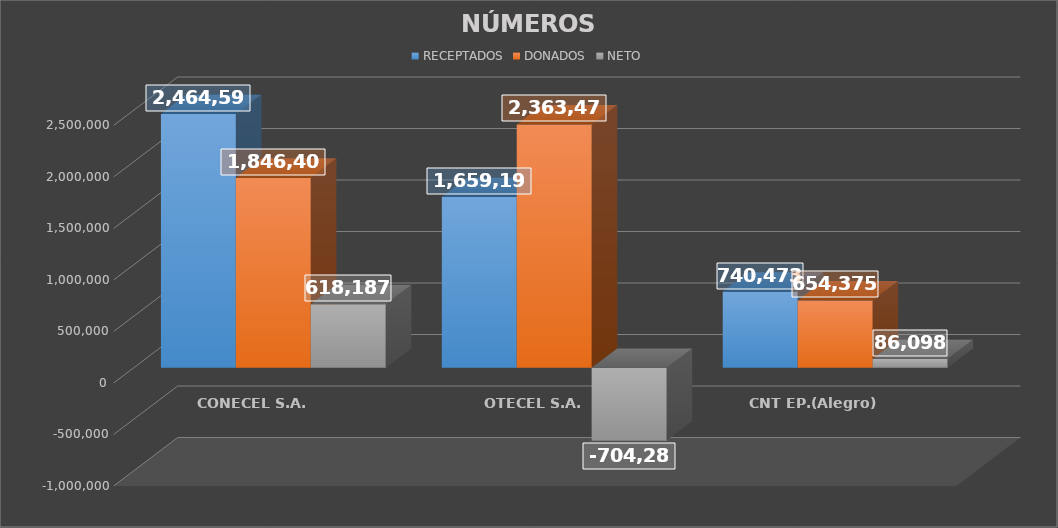
| Category | RECEPTADOS | DONADOS | NETO |
|---|---|---|---|
| CONECEL S.A. | 2464591 | 1846404 | 618187 |
| OTECEL S.A. | 1659191 | 2363476 | -704285 |
| CNT EP.(Alegro) | 740473 | 654375 | 86098 |